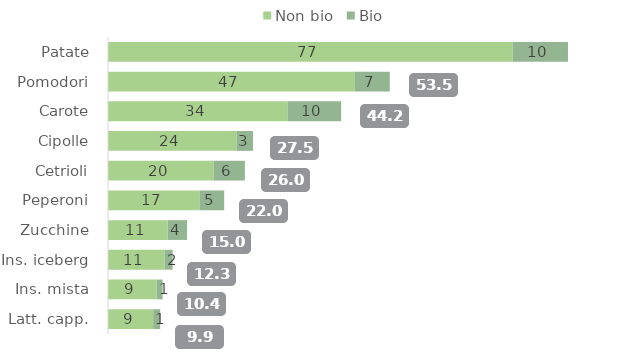
| Category | Non bio | Bio |
|---|---|---|
| Patate | 76.808 | 10.472 |
| Pomodori | 46.86 | 6.607 |
| Carote | 34.064 | 10.178 |
| Cipolle | 24.376 | 3.141 |
| Cetrioli | 20.06 | 5.909 |
| Peperoni | 17.346 | 4.701 |
| Zucchine | 11.312 | 3.685 |
| Ins. iceberg | 10.745 | 1.513 |
| Ins. mista | 9.216 | 1.139 |
| Latt. capp. | 8.57 | 1.334 |